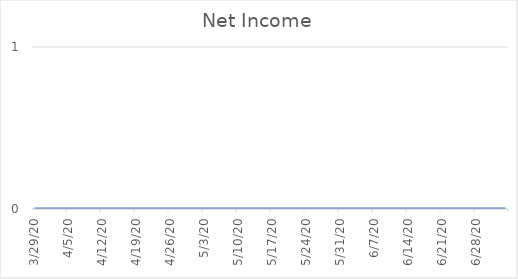
| Category | Series 0 |
|---|---|
| 3/29/20 | 0 |
| 3/30/20 | 0 |
| 3/31/20 | 0 |
| 4/1/20 | 0 |
| 4/2/20 | 0 |
| 4/3/20 | 0 |
| 4/4/20 | 0 |
| 4/5/20 | 0 |
| 4/6/20 | 0 |
| 4/7/20 | 0 |
| 4/8/20 | 0 |
| 4/9/20 | 0 |
| 4/10/20 | 0 |
| 4/11/20 | 0 |
| 4/12/20 | 0 |
| 4/13/20 | 0 |
| 4/14/20 | 0 |
| 4/15/20 | 0 |
| 4/16/20 | 0 |
| 4/17/20 | 0 |
| 4/18/20 | 0 |
| 4/19/20 | 0 |
| 4/20/20 | 0 |
| 4/21/20 | 0 |
| 4/22/20 | 0 |
| 4/23/20 | 0 |
| 4/24/20 | 0 |
| 4/25/20 | 0 |
| 4/26/20 | 0 |
| 4/27/20 | 0 |
| 4/28/20 | 0 |
| 4/29/20 | 0 |
| 4/30/20 | 0 |
| 5/1/20 | 0 |
| 5/2/20 | 0 |
| 5/3/20 | 0 |
| 5/4/20 | 0 |
| 5/5/20 | 0 |
| 5/6/20 | 0 |
| 5/7/20 | 0 |
| 5/8/20 | 0 |
| 5/9/20 | 0 |
| 5/10/20 | 0 |
| 5/11/20 | 0 |
| 5/12/20 | 0 |
| 5/13/20 | 0 |
| 5/14/20 | 0 |
| 5/15/20 | 0 |
| 5/16/20 | 0 |
| 5/17/20 | 0 |
| 5/18/20 | 0 |
| 5/19/20 | 0 |
| 5/20/20 | 0 |
| 5/21/20 | 0 |
| 5/22/20 | 0 |
| 5/23/20 | 0 |
| 5/24/20 | 0 |
| 5/25/20 | 0 |
| 5/26/20 | 0 |
| 5/27/20 | 0 |
| 5/28/20 | 0 |
| 5/29/20 | 0 |
| 5/30/20 | 0 |
| 5/31/20 | 0 |
| 6/1/20 | 0 |
| 6/2/20 | 0 |
| 6/3/20 | 0 |
| 6/4/20 | 0 |
| 6/5/20 | 0 |
| 6/6/20 | 0 |
| 6/7/20 | 0 |
| 6/8/20 | 0 |
| 6/9/20 | 0 |
| 6/10/20 | 0 |
| 6/11/20 | 0 |
| 6/12/20 | 0 |
| 6/13/20 | 0 |
| 6/14/20 | 0 |
| 6/15/20 | 0 |
| 6/16/20 | 0 |
| 6/17/20 | 0 |
| 6/18/20 | 0 |
| 6/19/20 | 0 |
| 6/20/20 | 0 |
| 6/21/20 | 0 |
| 6/22/20 | 0 |
| 6/23/20 | 0 |
| 6/24/20 | 0 |
| 6/25/20 | 0 |
| 6/26/20 | 0 |
| 6/27/20 | 0 |
| 6/28/20 | 0 |
| 6/29/20 | 0 |
| 6/30/20 | 0 |
| 7/1/20 | 0 |
| 7/2/20 | 0 |
| 7/3/20 | 0 |
| 7/4/20 | 0 |